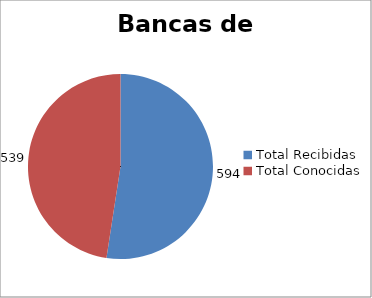
| Category | Series 0 |
|---|---|
| Total Recibidas | 594 |
| Total Conocidas | 539 |